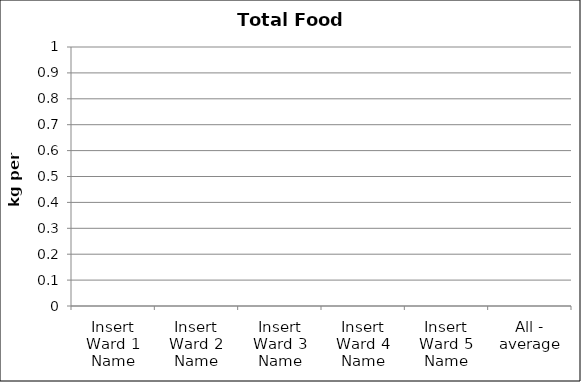
| Category | Total Food Waste |
|---|---|
| Insert Ward 1 Name | 0 |
| Insert Ward 2 Name | 0 |
| Insert Ward 3 Name | 0 |
| Insert Ward 4 Name | 0 |
| Insert Ward 5 Name | 0 |
| All - average | 0 |